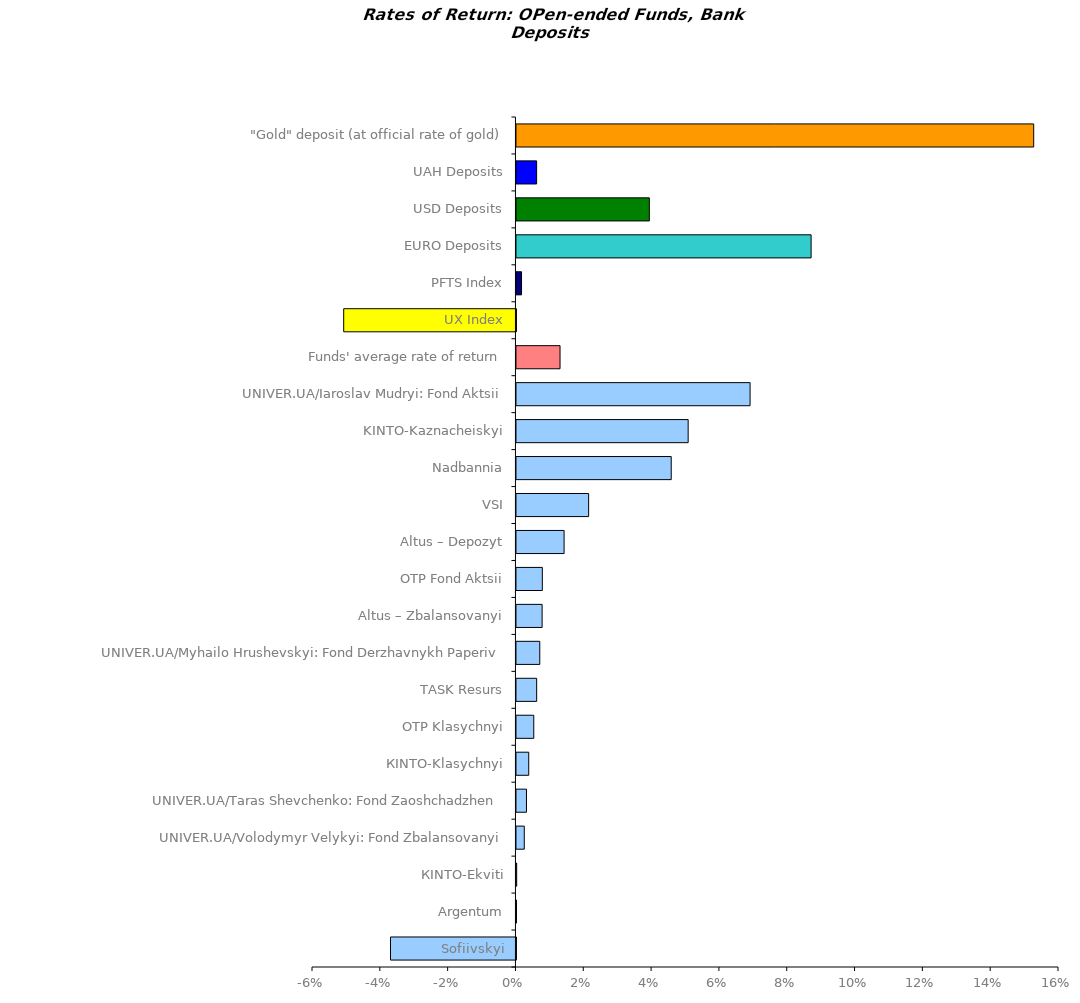
| Category | Series 0 |
|---|---|
| Sofiivskyi | -0.037 |
| Argentum | 0 |
| КІNTO-Ekviti | 0 |
| UNIVER.UA/Volodymyr Velykyi: Fond Zbalansovanyi | 0.002 |
| UNIVER.UA/Taras Shevchenko: Fond Zaoshchadzhen | 0.003 |
| КІNТО-Klasychnyi | 0.004 |
| OTP Klasychnyi | 0.005 |
| ТАSK Resurs | 0.006 |
| UNIVER.UA/Myhailo Hrushevskyi: Fond Derzhavnykh Paperiv | 0.007 |
| Altus – Zbalansovanyi | 0.008 |
| OTP Fond Aktsii | 0.008 |
| Altus – Depozyt | 0.014 |
| VSI | 0.021 |
| Nadbannia | 0.046 |
| KINTO-Kaznacheiskyi | 0.051 |
| UNIVER.UA/Iaroslav Mudryi: Fond Aktsii | 0.069 |
| Funds' average rate of return | 0.013 |
| UX Index | -0.051 |
| PFTS Index | 0.002 |
| EURO Deposits | 0.087 |
| USD Deposits | 0.039 |
| UAH Deposits | 0.006 |
| "Gold" deposit (at official rate of gold) | 0.153 |